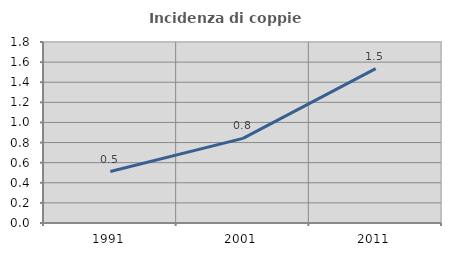
| Category | Incidenza di coppie miste |
|---|---|
| 1991.0 | 0.512 |
| 2001.0 | 0.842 |
| 2011.0 | 1.535 |